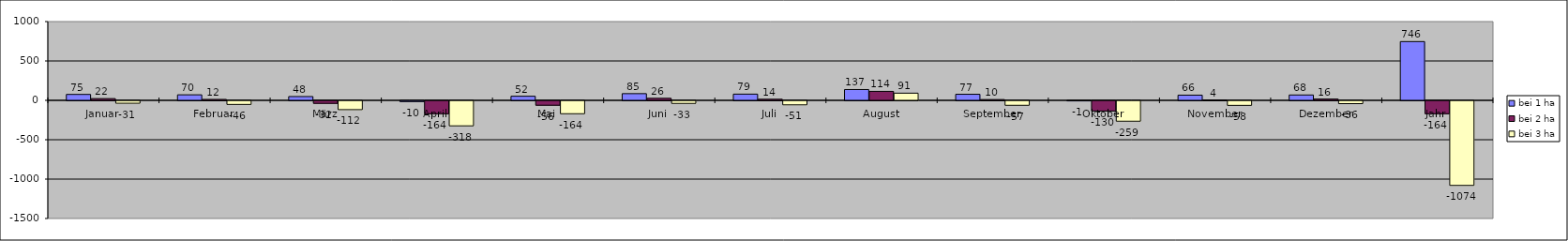
| Category | bei 1 ha  | bei 2 ha | bei 3 ha |
|---|---|---|---|
| Januar | 75 | 22 | -31 |
| Februar | 70 | 12 | -46 |
| März | 48 | -32 | -112 |
| April | -10 | -164 | -318 |
| Mai | 52 | -56 | -164 |
| Juni | 85 | 26 | -33 |
| Juli | 79 | 14 | -51 |
| August | 137 | 114 | 91 |
| September | 77 | 10 | -57 |
| Oktober | -1 | -130 | -259 |
| November | 66 | 4 | -58 |
| Dezember | 68 | 16 | -36 |
| Jahr | 746 | -164 | -1074 |